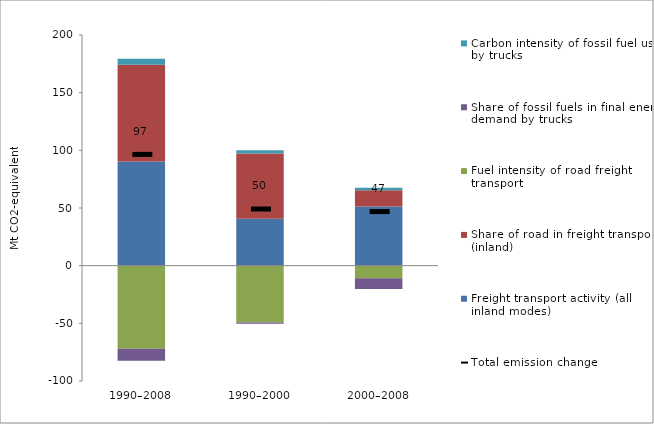
| Category | Freight transport activity (all inland modes) | Share of road in freight transport (inland) | Fuel intensity of road freight transport | Share of fossil fuels in final energy demand by trucks | Carbon intensity of fossil fuel use by trucks |
|---|---|---|---|---|---|
| 1990–2008 | 90.413 | 83.797 | -71.963 | -10.44 | 5.091 |
| 1990–2000 | 40.773 | 56.581 | -49.332 | -1.096 | 2.642 |
| 2000–2008 | 51.281 | 14.191 | -10.94 | -9.215 | 2.013 |